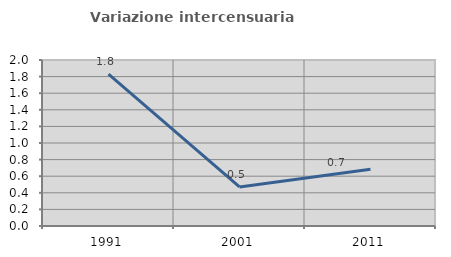
| Category | Variazione intercensuaria annua |
|---|---|
| 1991.0 | 1.83 |
| 2001.0 | 0.47 |
| 2011.0 | 0.683 |